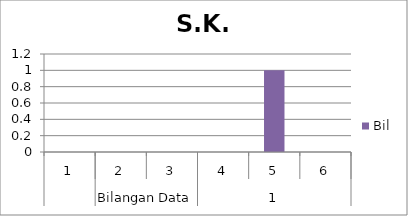
| Category | Bil |
|---|---|
| 0 | 0 |
| 1 | 0 |
| 2 | 0 |
| 3 | 0 |
| 4 | 1 |
| 5 | 0 |